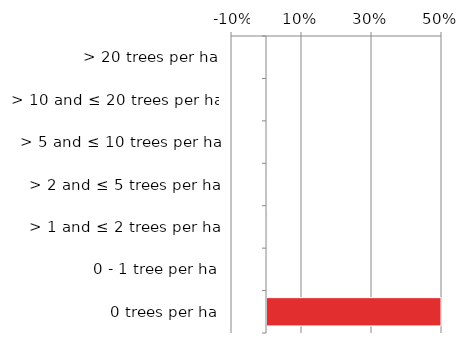
| Category | Non native |
|---|---|
| 0 trees per ha | 0.5 |
| 0 - 1 tree per ha | 0 |
| > 1 and ≤ 2 trees per ha | 0 |
| > 2 and ≤ 5 trees per ha | 0 |
| > 5 and ≤ 10 trees per ha | 0 |
| > 10 and ≤ 20 trees per ha | 0 |
| > 20 trees per ha | 0 |